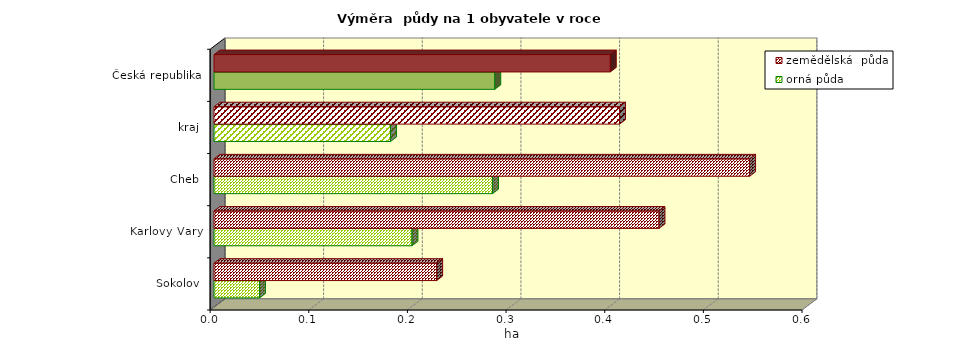
| Category | orná půda | zemědělská  půda |
|---|---|---|
| Sokolov | 0.046 | 0.226 |
| Karlovy Vary | 0.201 | 0.451 |
| Cheb | 0.282 | 0.543 |
| kraj | 0.179 | 0.411 |
| Česká republika | 0.285 | 0.402 |